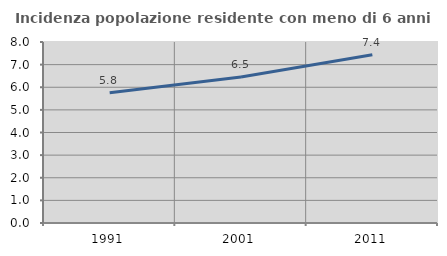
| Category | Incidenza popolazione residente con meno di 6 anni |
|---|---|
| 1991.0 | 5.755 |
| 2001.0 | 6.456 |
| 2011.0 | 7.438 |